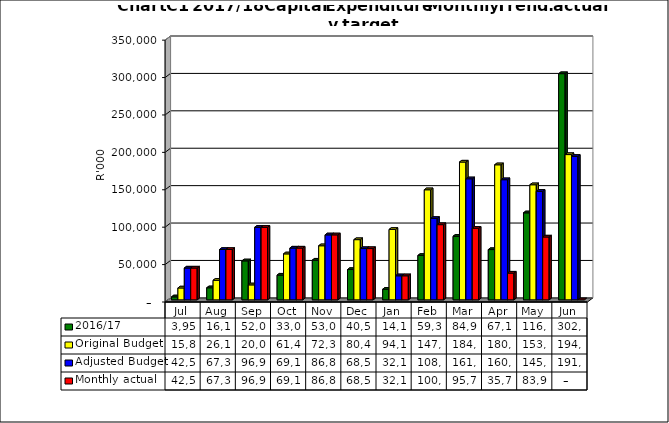
| Category | 2016/17 | Original Budget | Adjusted Budget | Monthly actual |
|---|---|---|---|---|
| Jul | 3958013.321 | 15888227.121 | 42514077.958 | 42514077.958 |
| Aug | 16119878.958 | 26147045.201 | 67305085.712 | 67305085.712 |
| Sep | 52071773.847 | 20000000 | 96927101.019 | 96927101.019 |
| Oct | 33023091.668 | 61424090.403 | 69191121.856 | 69191121.856 |
| Nov | 53074277.766 | 72300520.141 | 86835890.219 | 86835890.219 |
| Dec | 40503251.183 | 80450520.141 | 68525464.005 | 68525464.005 |
| Jan | 14140244.7 | 94117062.52 | 32153725.45 | 32153725.45 |
| Feb | 59318767.097 | 147118047.537 | 108760288.608 | 100484240.705 |
| Mar | 84955280.367 | 184167062.52 | 161756536.771 | 95751647.049 |
| Apr | 67166855.65 | 180519809.357 | 160571171.21 | 35747463.965 |
| May | 116269357.366 | 153826239.095 | 145082000 | 83980190.708 |
| Jun | 302312762.406 | 194159375.962 | 191756536.771 | 0 |